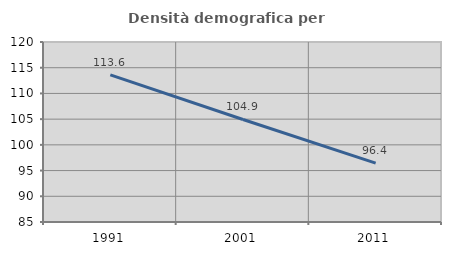
| Category | Densità demografica |
|---|---|
| 1991.0 | 113.615 |
| 2001.0 | 104.94 |
| 2011.0 | 96.448 |